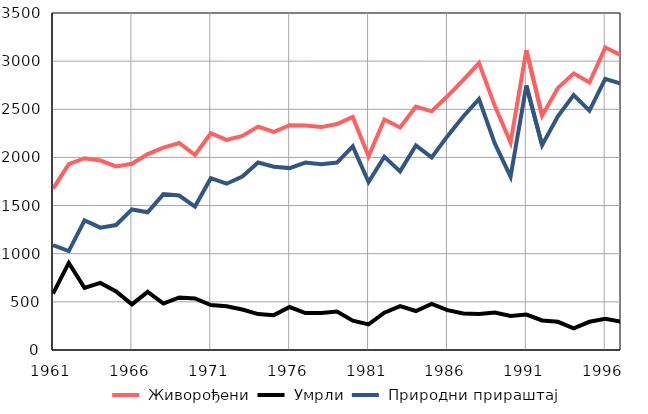
| Category |  Живорођени |  Умрли |  Природни прираштај |
|---|---|---|---|
| 1961.0 | 1675 | 586 | 1089 |
| 1962.0 | 1931 | 904 | 1027 |
| 1963.0 | 1992 | 646 | 1346 |
| 1964.0 | 1968 | 697 | 1271 |
| 1965.0 | 1906 | 608 | 1298 |
| 1966.0 | 1934 | 474 | 1460 |
| 1967.0 | 2034 | 604 | 1430 |
| 1968.0 | 2101 | 482 | 1619 |
| 1969.0 | 2150 | 546 | 1604 |
| 1970.0 | 2025 | 535 | 1490 |
| 1971.0 | 2251 | 467 | 1784 |
| 1972.0 | 2182 | 455 | 1727 |
| 1973.0 | 2223 | 421 | 1802 |
| 1974.0 | 2320 | 373 | 1947 |
| 1975.0 | 2265 | 362 | 1903 |
| 1976.0 | 2335 | 446 | 1889 |
| 1977.0 | 2331 | 384 | 1947 |
| 1978.0 | 2315 | 385 | 1930 |
| 1979.0 | 2347 | 400 | 1947 |
| 1980.0 | 2420 | 305 | 2115 |
| 1981.0 | 2011 | 266 | 1745 |
| 1982.0 | 2394 | 387 | 2007 |
| 1983.0 | 2311 | 456 | 1855 |
| 1984.0 | 2529 | 405 | 2124 |
| 1985.0 | 2479 | 479 | 2000 |
| 1986.0 | 2635 | 414 | 2221 |
| 1987.0 | 2804 | 379 | 2425 |
| 1988.0 | 2980 | 375 | 2605 |
| 1989.0 | 2536 | 390 | 2146 |
| 1990.0 | 2155 | 354 | 1801 |
| 1991.0 | 3114 | 368 | 2746 |
| 1992.0 | 2434 | 307 | 2127 |
| 1993.0 | 2721 | 293 | 2428 |
| 1994.0 | 2873 | 225 | 2648 |
| 1995.0 | 2778 | 293 | 2485 |
| 1996.0 | 3141 | 325 | 2816 |
| 1997.0 | 3061 | 295 | 2766 |